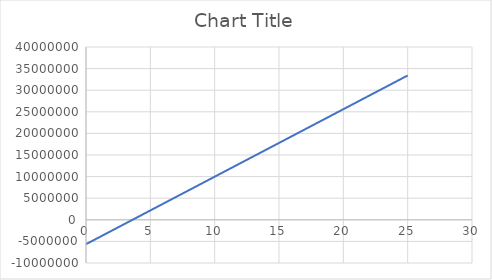
| Category | Series 0 |
|---|---|
| 0.0 | -5645440.394 |
| 1.0 | -4083232.4 |
| 2.0 | -2521024.406 |
| 3.0 | -958816.411 |
| 4.0 | 603391.583 |
| 5.0 | 2165599.577 |
| 6.0 | 3727807.572 |
| 7.0 | 5290015.566 |
| 8.0 | 6852223.56 |
| 9.0 | 8414431.555 |
| 10.0 | 9976639.549 |
| 11.0 | 11538847.544 |
| 12.0 | 13101055.538 |
| 13.0 | 14663263.532 |
| 14.0 | 16225471.527 |
| 15.0 | 17787679.521 |
| 16.0 | 19349887.515 |
| 17.0 | 20912095.51 |
| 18.0 | 22474303.504 |
| 19.0 | 24036511.498 |
| 20.0 | 25598719.493 |
| 21.0 | 27160927.487 |
| 22.0 | 28723135.482 |
| 23.0 | 30285343.476 |
| 24.0 | 31847551.47 |
| 25.0 | 33409759.465 |